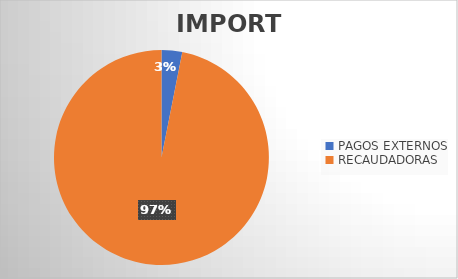
| Category | IMPORTE |
|---|---|
| PAGOS EXTERNOS | 13229803.74 |
| RECAUDADORAS | 412516565.81 |